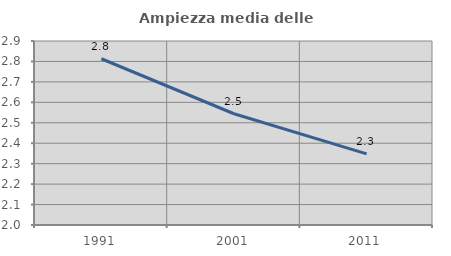
| Category | Ampiezza media delle famiglie |
|---|---|
| 1991.0 | 2.813 |
| 2001.0 | 2.544 |
| 2011.0 | 2.348 |